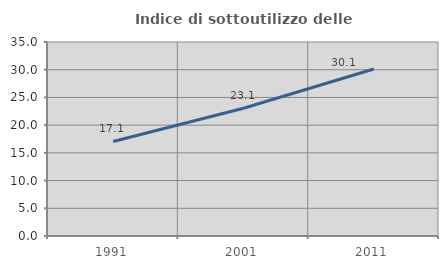
| Category | Indice di sottoutilizzo delle abitazioni  |
|---|---|
| 1991.0 | 17.052 |
| 2001.0 | 23.058 |
| 2011.0 | 30.123 |